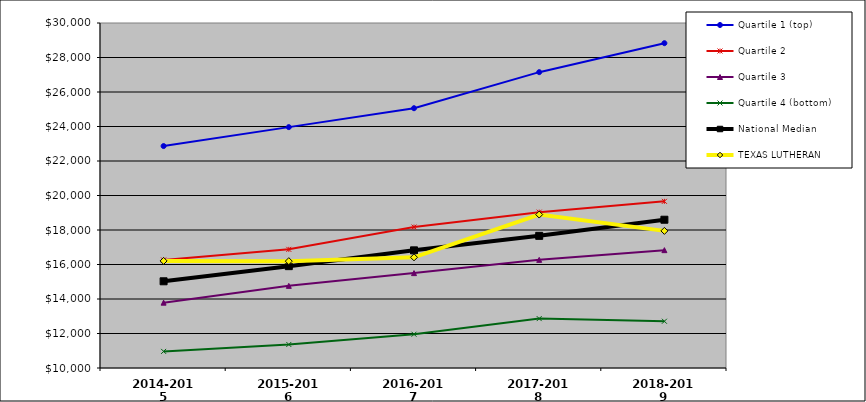
| Category | Quartile 1 (top) | Quartile 2 | Quartile 3 | Quartile 4 (bottom) | National Median |  TEXAS LUTHERAN  |
|---|---|---|---|---|---|---|
| 2014-2015 | 22866 | 16261 | 13788.5 | 10963 | 15026.5 | 16208 |
| 2015-2016 | 23964 | 16878 | 14761.5 | 11364 | 15904.5 | 16193 |
| 2016-2017 | 25060 | 18170.5 | 15500.5 | 11958 | 16820.5 | 16415 |
| 2017-2018 | 27150 | 19034.5 | 16269.5 | 12864 | 17661 | 18895 |
| 2018-2019 | 28830 | 19661.5 | 16832 | 12711 | 18596 | 17949 |